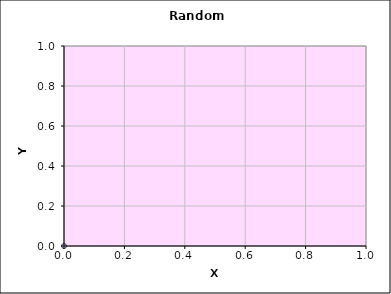
| Category | 0.91683 |
|---|---|
| 0.488513474101981 | 0.675 |
| 0.9827563576388147 | 0.976 |
| 0.5994831599727677 | 0.195 |
| 0.19274700075458306 | 0.09 |
| 0.1738905436072411 | 0.292 |
| 0.25690290155942197 | 0.241 |
| 0.7906620908350557 | 0.421 |
| 0.5589270799657597 | 0.528 |
| 0.03669690012554572 | 0.741 |
| 0.4348288110814984 | 0.586 |
| 0.9256468063797731 | 0.579 |
| 0.08539227905528968 | 0.621 |
| 0.42413449198404973 | 0.511 |
| 0.1993933688403149 | 0.833 |
| 0.24813032540125546 | 0.682 |
| 0.3556405079164342 | 0.147 |